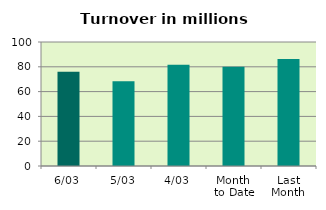
| Category | Series 0 |
|---|---|
| 6/03 | 76.016 |
| 5/03 | 68.376 |
| 4/03 | 81.665 |
| Month 
to Date | 79.955 |
| Last
Month | 86.247 |